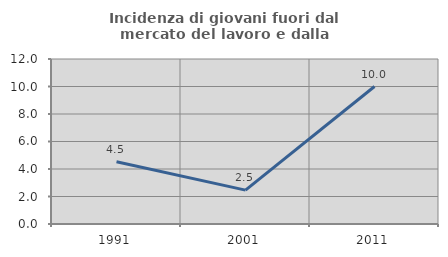
| Category | Incidenza di giovani fuori dal mercato del lavoro e dalla formazione  |
|---|---|
| 1991.0 | 4.53 |
| 2001.0 | 2.463 |
| 2011.0 | 10 |